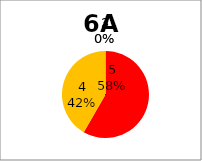
| Category | Series 0 |
|---|---|
| 5.0 | 7 |
| 4.0 | 5 |
| 3.0 | 0 |
| 2.0 | 0 |